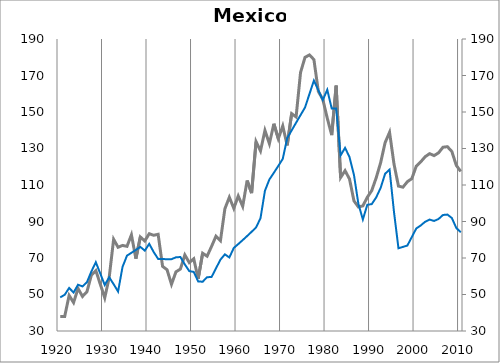
| Category | Mex17 |
|---|---|
| 1920.0 | 37.941 |
| 1921.0 | 37.941 |
| 1922.0 | 49.503 |
| 1923.0 | 45.574 |
| 1924.0 | 53.319 |
| 1925.0 | 48.942 |
| 1926.0 | 51.523 |
| 1927.0 | 60.616 |
| 1928.0 | 63.085 |
| 1929.0 | 55.677 |
| 1930.0 | 48.156 |
| 1931.0 | 59.269 |
| 1932.0 | 80.26 |
| 1933.0 | 75.882 |
| 1934.0 | 76.892 |
| 1935.0 | 76.383 |
| 1936.0 | 82.704 |
| 1937.0 | 69.645 |
| 1938.0 | 81.527 |
| 1939.0 | 79.329 |
| 1940.0 | 83.303 |
| 1941.0 | 82.444 |
| 1942.0 | 82.991 |
| 1943.0 | 65.398 |
| 1944.0 | 63.576 |
| 1945.0 | 55.59 |
| 1946.0 | 62.41 |
| 1947.0 | 63.934 |
| 1948.0 | 71.685 |
| 1949.0 | 67.458 |
| 1950.0 | 69.576 |
| 1951.0 | 58.628 |
| 1952.0 | 72.626 |
| 1953.0 | 71.001 |
| 1954.0 | 76.34 |
| 1955.0 | 81.973 |
| 1956.0 | 79.491 |
| 1957.0 | 97.021 |
| 1958.0 | 103.286 |
| 1959.0 | 97.197 |
| 1960.0 | 103.979 |
| 1961.0 | 98.31 |
| 1962.0 | 112.464 |
| 1963.0 | 105.557 |
| 1964.0 | 133.8 |
| 1965.0 | 128.643 |
| 1966.0 | 139.865 |
| 1967.0 | 132.602 |
| 1968.0 | 143.579 |
| 1969.0 | 135.359 |
| 1970.0 | 142.338 |
| 1971.0 | 131.705 |
| 1972.0 | 149.126 |
| 1973.0 | 147.295 |
| 1974.0 | 171.69 |
| 1975.0 | 179.941 |
| 1976.0 | 181.273 |
| 1977.0 | 178.724 |
| 1978.0 | 161.24 |
| 1979.0 | 156.911 |
| 1980.0 | 146.651 |
| 1981.0 | 137.344 |
| 1982.0 | 164.473 |
| 1983.0 | 114.096 |
| 1984.0 | 117.852 |
| 1985.0 | 113.294 |
| 1986.0 | 101.31 |
| 1987.0 | 97.964 |
| 1988.0 | 98.566 |
| 1989.0 | 103.26 |
| 1990.0 | 106.991 |
| 1991.0 | 113.971 |
| 1992.0 | 122.275 |
| 1993.0 | 133.227 |
| 1994.0 | 138.883 |
| 1995.0 | 121.433 |
| 1996.0 | 109.398 |
| 1997.0 | 108.796 |
| 1998.0 | 111.805 |
| 1999.0 | 113.489 |
| 2000.0 | 120.349 |
| 2001.0 | 122.675 |
| 2002.0 | 125.504 |
| 2003.0 | 127.174 |
| 2004.0 | 126.114 |
| 2005.0 | 127.606 |
| 2006.0 | 130.685 |
| 2007.0 | 130.992 |
| 2008.0 | 128.339 |
| 2009.0 | 120.707 |
| 2010.0 | 117.441 |